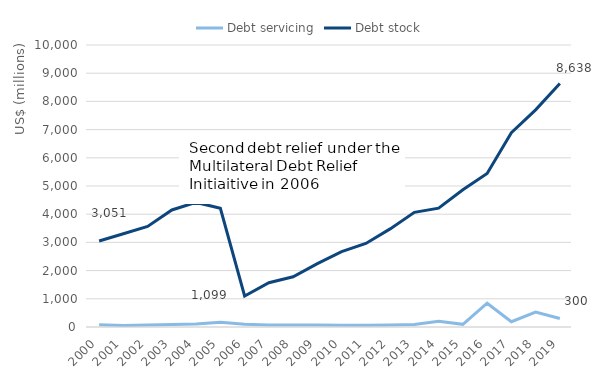
| Category | Debt servicing | Debt stock |
|---|---|---|
| 2000 | 75.656 | 3051.302 |
| 2001 | 50.949 | 3304.841 |
| 2002 | 71.248 | 3564.532 |
| 2003 | 90.865 | 4150.225 |
| 2004 | 103.414 | 4417.544 |
| 2005 | 171.761 | 4208.685 |
| 2006 | 99.855 | 1099.38 |
| 2007 | 66.621 | 1570.676 |
| 2008 | 74.201 | 1780.11 |
| 2009 | 71.828 | 2247.244 |
| 2010 | 63.49 | 2672.931 |
| 2011 | 63.627 | 2963.297 |
| 2012 | 68.045 | 3478.408 |
| 2013 | 87.614 | 4064.481 |
| 2014 | 206.377 | 4212.824 |
| 2015 | 94.794 | 4869.307 |
| 2016 | 844.447 | 5445.727 |
| 2017 | 187.853 | 6889.574 |
| 2018 | 529.039 | 7700.546 |
| 2019 | 300.062 | 8637.661 |